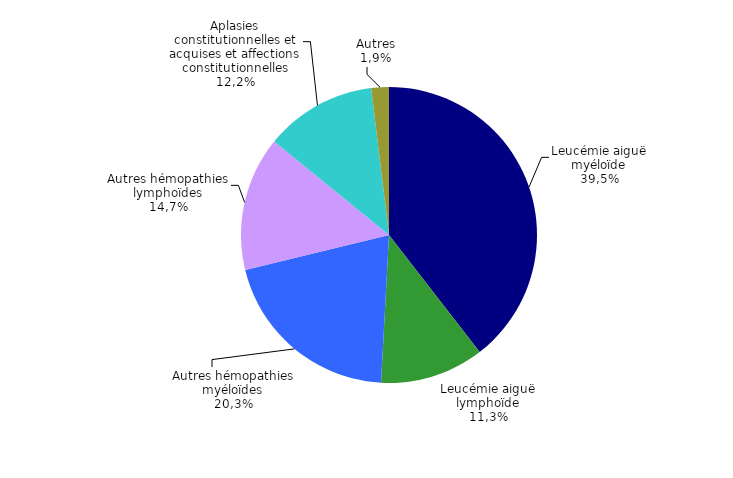
| Category | Nombre |
|---|---|
| Leucémie aiguë myéloïde | 369 |
| Leucémie aiguë lymphoïde | 106 |
| Autres hémopathies myéloïdes | 190 |
| Autres hémopathies lymphoïdes | 137 |
| Aplasies constitutionnelles et acquises et affections constitutionnelles | 114 |
| Autres | 18 |